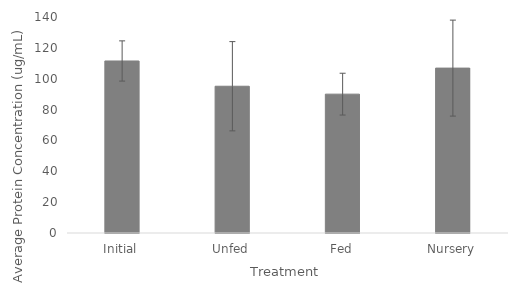
| Category | Series 0 |
|---|---|
| Initial | 111.5 |
| Unfed | 95.125 |
| Fed | 90 |
| Nursery | 106.875 |